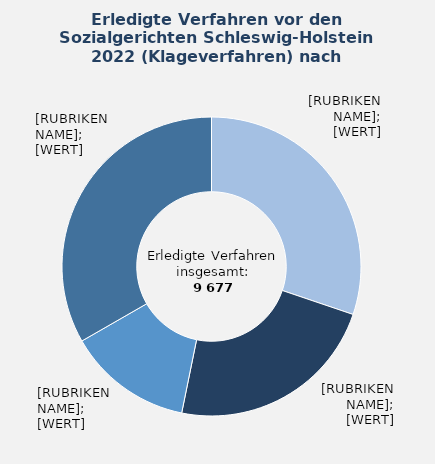
| Category | in Prozent |
|---|---|
| Krankenversicherung | 30.2 |
| Angelegenheiten nach dem SGB II | 23 |
| Rentenversicherung | 13.5 |
| Übrige Sachgebiete¹ | 33.3 |